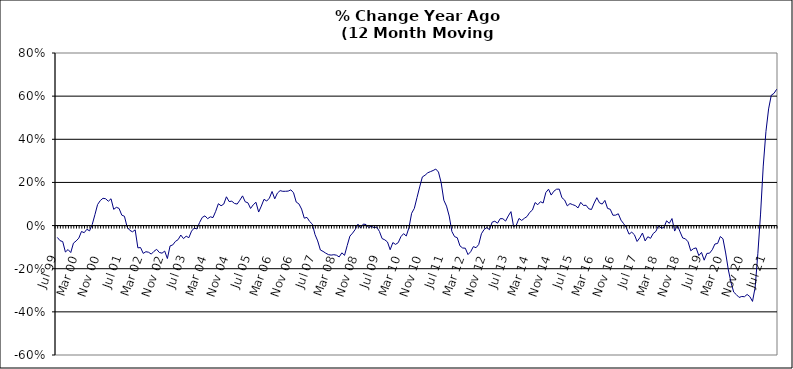
| Category | Series 0 |
|---|---|
| Jul 99 | -0.055 |
| Aug 99 | -0.07 |
| Sep 99 | -0.074 |
| Oct 99 | -0.123 |
| Nov 99 | -0.111 |
| Dec 99 | -0.125 |
| Jan 00 | -0.082 |
| Feb 00 | -0.071 |
| Mar 00 | -0.058 |
| Apr 00 | -0.027 |
| May 00 | -0.033 |
| Jun 00 | -0.017 |
| Jul 00 | -0.025 |
| Aug 00 | 0.005 |
| Sep 00 | 0.05 |
| Oct 00 | 0.098 |
| Nov 00 | 0.116 |
| Dec 00 | 0.127 |
| Jan 01 | 0.124 |
| Feb 01 | 0.113 |
| Mar 01 | 0.124 |
| Apr 01 | 0.075 |
| May 01 | 0.085 |
| Jun 01 | 0.08 |
| Jul 01 | 0.048 |
| Aug 01 | 0.043 |
| Sep 01 | -0.007 |
| Oct 01 | -0.022 |
| Nov 01 | -0.029 |
| Dec 01 | -0.02 |
| Jan 02 | -0.103 |
| Feb 02 | -0.102 |
| Mar 02 | -0.129 |
| Apr 02 | -0.121 |
| May 02 | -0.124 |
| Jun 02 | -0.132 |
| Jul 02 | -0.119 |
| Aug 02 | -0.11 |
| Sep 02 | -0.125 |
| Oct 02 | -0.128 |
| Nov 02 | -0.118 |
| Dec 02 | -0.153 |
| Jan 03 | -0.094 |
| Feb 03 | -0.09 |
| Mar 03 | -0.073 |
| Apr 03 | -0.065 |
| May 03 | -0.044 |
| Jun 03 | -0.06 |
| Jul 03 | -0.049 |
| Aug 03 | -0.056 |
| Sep 03 | -0.026 |
| Oct 03 | -0.012 |
| Nov 03 | -0.016 |
| Dec 03 | 0.014 |
| Jan 04 | 0.038 |
| Feb 04 | 0.045 |
| Mar 04 | 0.032 |
| Apr 04 | 0.041 |
| May 04 | 0.037 |
| Jun 04 | 0.066 |
| Jul 04 | 0.101 |
| Aug 04 | 0.092 |
| Sep 04 | 0.1 |
| Oct 04 | 0.133 |
| Nov 04 | 0.111 |
| Dec 04 | 0.113 |
| Jan 05 | 0.103 |
| Feb 05 | 0.1 |
| Mar 05 | 0.118 |
| Apr 05 | 0.138 |
| May 05 | 0.11 |
| Jun 05 | 0.106 |
| Jul 05 | 0.079 |
| Aug 05 | 0.097 |
| Sep 05 | 0.108 |
| Oct 05 | 0.063 |
| Nov 05 | 0.09 |
| Dec 05 | 0.122 |
| Jan 06 | 0.114 |
| Feb 06 | 0.127 |
| Mar 06 | 0.158 |
| Apr 06 | 0.124 |
| May 06 | 0.151 |
| Jun 06 | 0.162 |
| Jul 06 | 0.159 |
| Aug 06 | 0.159 |
| Sep 06 | 0.16 |
| Oct 06 | 0.166 |
| Nov 06 | 0.152 |
| Dec 06 | 0.109 |
| Jan 07 | 0.101 |
| Feb 07 | 0.076 |
| Mar 07 | 0.034 |
| Apr 07 | 0.038 |
| May 07 | 0.019 |
| Jun 07 | 0.007 |
| Jul 07 | -0.041 |
| Aug 07 | -0.071 |
| Sep 07 | -0.113 |
| Oct 07 | -0.12 |
| Nov 07 | -0.128 |
| Dec 07 | -0.135 |
| Jan 08 | -0.137 |
| Feb 08 | -0.135 |
| Mar 08 | -0.137 |
| Apr 08 | -0.145 |
| May 08 | -0.126 |
| Jun 08 | -0.138 |
| Jul 08 | -0.093 |
| Aug 08 | -0.049 |
| Sep-08 | -0.035 |
| Oct 08 | -0.018 |
| Nov 08 | 0.007 |
| Dec 08 | -0.011 |
| Jan 09 | 0.007 |
| Feb 09 | 0.005 |
| Mar 09 | -0.009 |
| Apr 09 | -0.003 |
| May 09 | -0.01 |
| Jun 09 | -0.007 |
| Jul 09 | -0.027 |
| Aug 09 | -0.06 |
| Sep 09 | -0.066 |
| Oct 09 | -0.076 |
| Nov 09 | -0.112 |
| Dec 09 | -0.079 |
| Jan 10 | -0.087 |
| Feb 10 | -0.079 |
| Mar 10 | -0.052 |
| Apr 10 | -0.037 |
| May 10 | -0.048 |
| Jun 10 | -0.01 |
| Jul 10 | 0.057 |
| Aug 10 | 0.08 |
| Sep 10 | 0.13 |
| Oct 10 | 0.179 |
| Nov 10 | 0.226 |
| Dec 10 | 0.233 |
| Jan 11 | 0.245 |
| Feb 11 | 0.25 |
| Mar 11 | 0.255 |
| Apr 11 | 0.262 |
| May 11 | 0.248 |
| Jun 11 | 0.199 |
| Jul 11 | 0.118 |
| Aug 11 | 0.09 |
| Sep 11 | 0.044 |
| Oct 11 | -0.028 |
| Nov 11 | -0.051 |
| Dec 11 | -0.056 |
| Jan 12 | -0.094 |
| Feb 12 | -0.104 |
| Mar 12 | -0.105 |
| Apr 12 | -0.134 |
| May 12 | -0.121 |
| Jun 12 | -0.098 |
| Jul 12 | -0.103 |
| Aug 12 | -0.087 |
| Sep 12 | -0.038 |
| Oct 12 | -0.018 |
| Nov 12 | -0.009 |
| Dec 12 | -0.019 |
| Jan 13 | 0.016 |
| Feb-13 | 0.02 |
| Mar-13 | 0.011 |
| Apr 13 | 0.032 |
| May 13 | 0.032 |
| Jun-13 | 0.021 |
| Jul 13 | 0.045 |
| Aug 13 | 0.065 |
| Sep 13 | -0.005 |
| Oct 13 | 0.002 |
| Nov 13 | 0.033 |
| Dec 13 | 0.024 |
| Jan 14 | 0.034 |
| Feb-14 | 0.042 |
| Mar 14 | 0.061 |
| Apr 14 | 0.072 |
| May 14 | 0.107 |
| Jun 14 | 0.097 |
| Jul-14 | 0.111 |
| Aug-14 | 0.105 |
| Sep 14 | 0.153 |
| Oct 14 | 0.169 |
| Nov 14 | 0.141 |
| Dec 14 | 0.159 |
| Jan 15 | 0.169 |
| Feb 15 | 0.169 |
| Mar 15 | 0.129 |
| Apr-15 | 0.118 |
| May 15 | 0.091 |
| Jun-15 | 0.102 |
| Jul 15 | 0.097 |
| Aug 15 | 0.092 |
| Sep 15 | 0.082 |
| Oct 15 | 0.108 |
| Nov 15 | 0.093 |
| Dec 15 | 0.094 |
| Jan 16 | 0.078 |
| Feb 16 | 0.075 |
| Mar 16 | 0.104 |
| Apr 16 | 0.129 |
| May 16 | 0.105 |
| Jun 16 | 0.1 |
| Jul 16 | 0.117 |
| Aug 16 | 0.08 |
| Sep 16 | 0.076 |
| Oct 16 | 0.048 |
| Nov 16 | 0.048 |
| Dec 16 | 0.055 |
| Jan 17 | 0.025 |
| Feb 17 | 0.009 |
| Mar 17 | -0.01 |
| Apr 17 | -0.04 |
| May 17 | -0.031 |
| Jun 17 | -0.042 |
| Jul 17 | -0.074 |
| Aug 17 | -0.057 |
| Sep 17 | -0.035 |
| Oct 17 | -0.071 |
| Nov 17 | -0.052 |
| Dec 17 | -0.059 |
| Jan 18 | -0.037 |
| Feb 18 | -0.027 |
| Mar 18 | 0 |
| Apr 18 | -0.012 |
| May 18 | -0.009 |
| Jun 18 | 0.022 |
| Jul 18 | 0.01 |
| Aug 18 | 0.033 |
| Sep 18 | -0.025 |
| Oct 18 | 0.002 |
| Nov 18 | -0.029 |
| Dec 18 | -0.058 |
| Jan 19 | -0.061 |
| Feb 19 | -0.075 |
| Mar 19 | -0.117 |
| Apr 19 | -0.107 |
| May 19 | -0.104 |
| Jun 19 | -0.139 |
| Jul 19 | -0.124 |
| Aug 19 | -0.16 |
| Sep 19 | -0.129 |
| Oct 19 | -0.128 |
| Nov 19 | -0.112 |
| Dec 19 | -0.085 |
| Jan 20 | -0.083 |
| Feb 20 | -0.051 |
| Mar 20 | -0.061 |
| Apr 20 | -0.127 |
| May 20 | -0.206 |
| Jun 20 | -0.264 |
| Jul 20 | -0.308 |
| Aug 20 | -0.32 |
| Sep 20 | -0.333 |
| Oct 20 | -0.329 |
| Nov 20 | -0.33 |
| Dec 20 | -0.319 |
| Jan 21 | -0.329 |
| Feb 21 | -0.352 |
| Mar 21 | -0.286 |
| Apr 21 | -0.129 |
| May 21 | 0.053 |
| Jun 21 | 0.276 |
| Jul 21 | 0.435 |
| Aug 21 | 0.541 |
| Sep 21 | 0.604 |
| Oct 21 | 0.613 |
| Nov 21 | 0.632 |